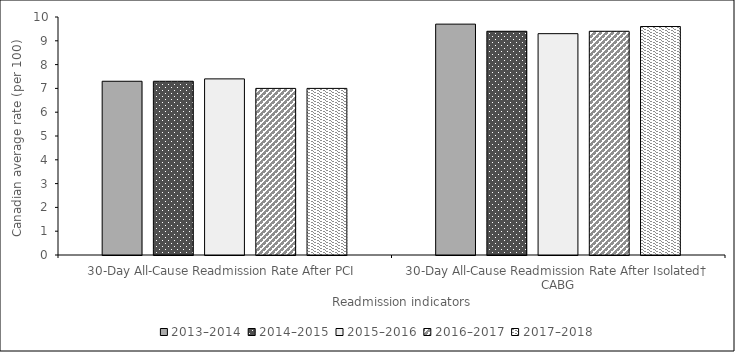
| Category | 2013–2014 | 2014–2015 | 2015–2016 | 2016–2017 | 2017–2018 |
|---|---|---|---|---|---|
| 30-Day All-Cause Readmission Rate After PCI | 7.3 | 7.3 | 7.4 | 7 | 7 |
| 30-Day All-Cause Readmission Rate After Isolated† CABG | 9.7 | 9.4 | 9.3 | 9.4 | 9.6 |